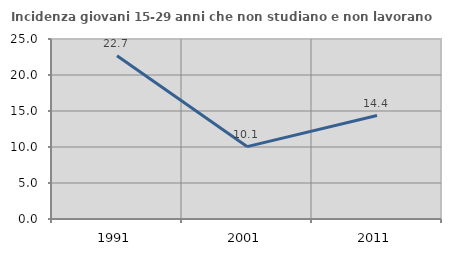
| Category | Incidenza giovani 15-29 anni che non studiano e non lavorano  |
|---|---|
| 1991.0 | 22.68 |
| 2001.0 | 10.056 |
| 2011.0 | 14.368 |